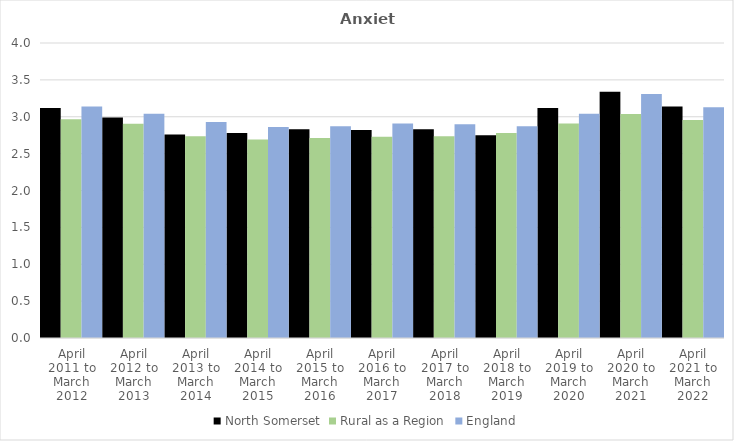
| Category | North Somerset | Rural as a Region | England |
|---|---|---|---|
| April 2011 to March 2012 | 3.12 | 2.967 | 3.14 |
| April 2012 to March 2013 | 2.99 | 2.904 | 3.04 |
| April 2013 to March 2014 | 2.76 | 2.734 | 2.93 |
| April 2014 to March 2015 | 2.78 | 2.691 | 2.86 |
| April 2015 to March 2016 | 2.83 | 2.711 | 2.87 |
| April 2016 to March 2017 | 2.82 | 2.729 | 2.91 |
| April 2017 to March 2018 | 2.83 | 2.736 | 2.9 |
| April 2018 to March 2019 | 2.75 | 2.78 | 2.87 |
| April 2019 to March 2020 | 3.12 | 2.908 | 3.04 |
| April 2020 to March 2021 | 3.34 | 3.036 | 3.31 |
| April 2021 to March 2022 | 3.14 | 2.956 | 3.13 |